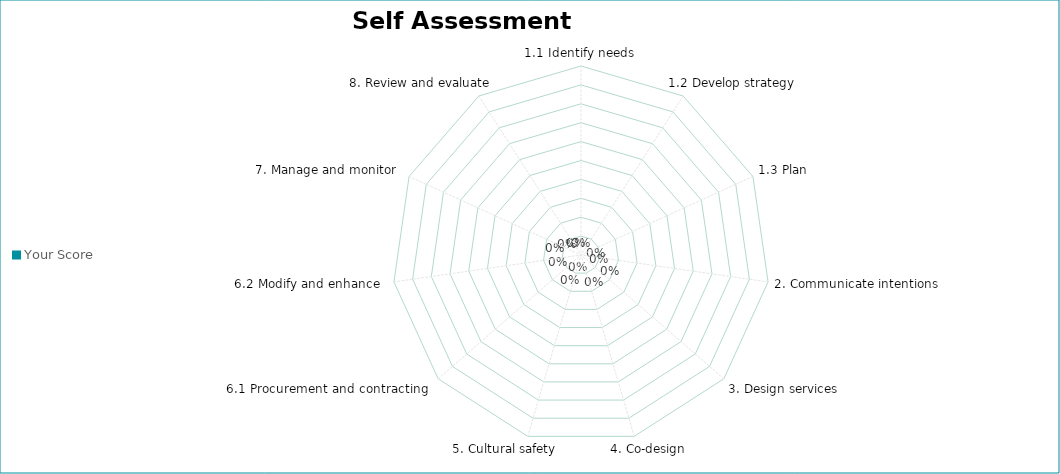
| Category | Your Score | Score out of  |
|---|---|---|
| 1.1 Identify needs | 0 |  |
| 1.2 Develop strategy | 0 |  |
| 1.3 Plan  | 0 |  |
| 2. Communicate intentions | 0 |  |
| 3. Design services | 0 |  |
| 4. Co-design | 0 |  |
| 5. Cultural safety | 0 |  |
| 6.1 Procurement and contracting  | 0 |  |
| 6.2 Modify and enhance  | 0 |  |
| 7. Manage and monitor  | 0 |  |
| 8. Review and evaluate | 0 |  |